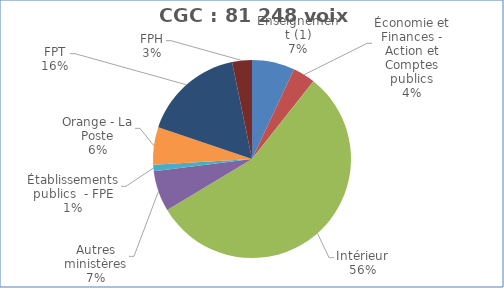
| Category | Nombre de voix |
|---|---|
| Enseignement (1) | 5667 |
| Économie et Finances - Action et Comptes publics | 2983.2 |
| Intérieur | 45270 |
| Autres ministères | 5411 |
| Établissements publics  - FPE | 850 |
| Orange - La Poste | 4986 |
| FPT | 13457 |
| FPH | 2624 |